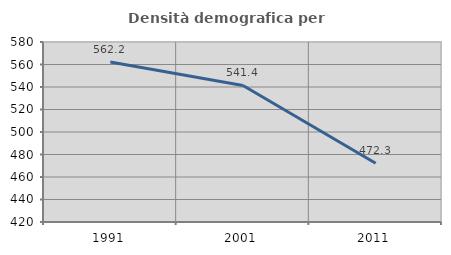
| Category | Densità demografica |
|---|---|
| 1991.0 | 562.171 |
| 2001.0 | 541.381 |
| 2011.0 | 472.29 |